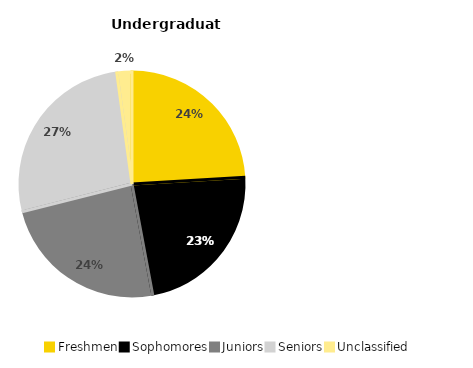
| Category | Series 0 |
|---|---|
| Freshmen | 0.24 |
| Sophomores | 0.23 |
| Juniors | 0.24 |
| Seniors | 0.268 |
| Unclassified | 0.022 |